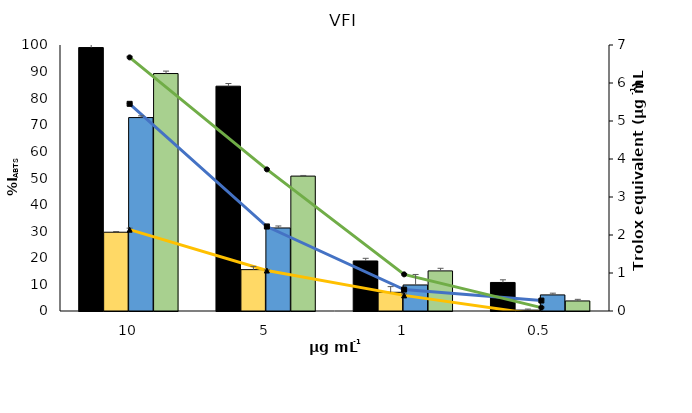
| Category | Trolox | Acetone | MeOH | EtOH 70% |
|---|---|---|---|---|
| 10.0 | 99.04 | 29.617 | 72.719 | 89.27 |
| 5.0 | 84.52 | 15.549 | 31.21 | 50.715 |
| 1.0 | 18.81 | 7.03 | 9.788 | 15.076 |
| 0.5 | 10.73 | 0.326 | 6.048 | 3.781 |